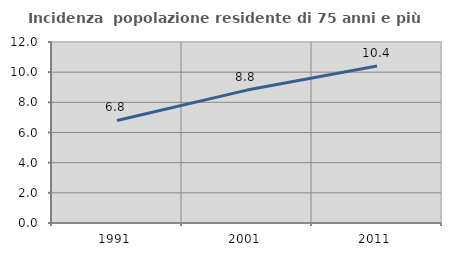
| Category | Incidenza  popolazione residente di 75 anni e più |
|---|---|
| 1991.0 | 6.798 |
| 2001.0 | 8.812 |
| 2011.0 | 10.415 |